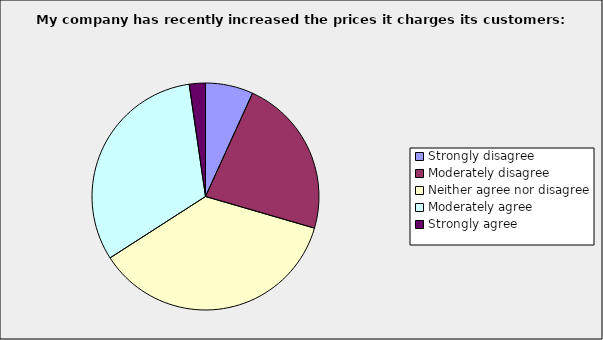
| Category | Series 0 |
|---|---|
| Strongly disagree | 0.068 |
| Moderately disagree | 0.227 |
| Neither agree nor disagree | 0.364 |
| Moderately agree | 0.318 |
| Strongly agree | 0.023 |